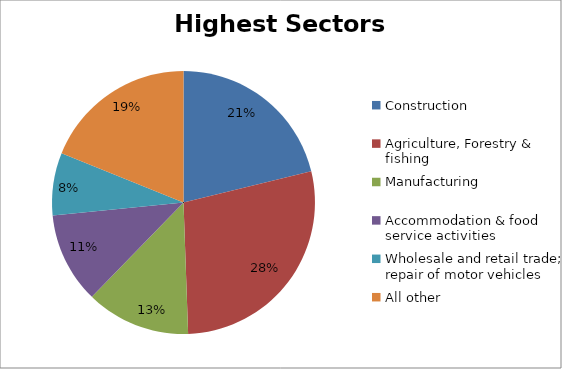
| Category | Sectors with highest totals | Percentage |
|---|---|---|
| Construction | 10568 | 0.212 |
| Agriculture, Forestry & fishing | 14086 | 0.282 |
| Manufacturing | 6397 | 0.128 |
| Accommodation & food service activities | 5568 | 0.112 |
| Wholesale and retail trade; repair of motor vehicles  | 3828 | 0.077 |
| All other | 9421 | 0.189 |